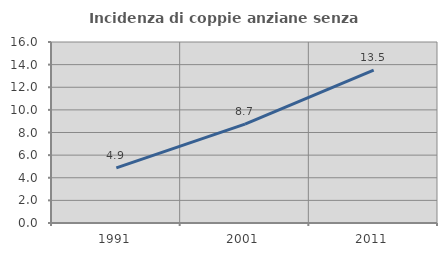
| Category | Incidenza di coppie anziane senza figli  |
|---|---|
| 1991.0 | 4.872 |
| 2001.0 | 8.737 |
| 2011.0 | 13.52 |